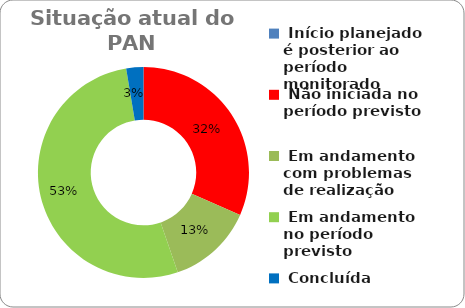
| Category | Series 0 |
|---|---|
|  Início planejado é posterior ao período monitorado | 0 |
|  Não iniciada no período previsto | 0.316 |
|  Em andamento com problemas de realização | 0.132 |
|  Em andamento no período previsto  | 0.526 |
|  Concluída | 0.026 |